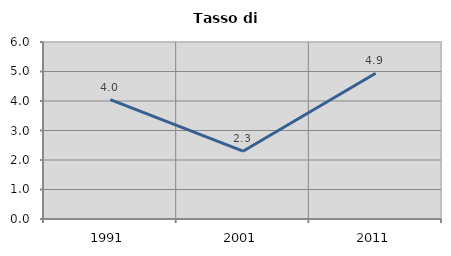
| Category | Tasso di disoccupazione   |
|---|---|
| 1991.0 | 4.044 |
| 2001.0 | 2.299 |
| 2011.0 | 4.943 |